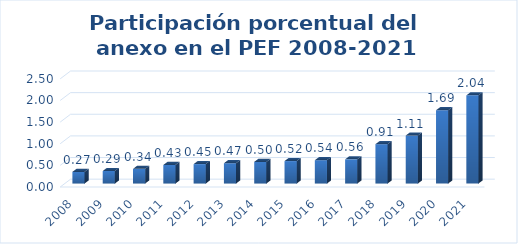
| Category | Participación porcentual del Anexo en el PEF |
|---|---|
| 2008.0 | 0.27 |
| 2009.0 | 0.29 |
| 2010.0 | 0.34 |
| 2011.0 | 0.43 |
| 2012.0 | 0.45 |
| 2013.0 | 0.47 |
| 2014.0 | 0.5 |
| 2015.0 | 0.52 |
| 2016.0 | 0.54 |
| 2017.0 | 0.56 |
| 2018.0 | 0.91 |
| 2019.0 | 1.11 |
| 2020.0 | 1.695 |
| 2021.0 | 2.039 |